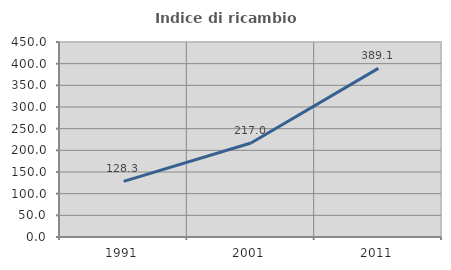
| Category | Indice di ricambio occupazionale  |
|---|---|
| 1991.0 | 128.344 |
| 2001.0 | 216.988 |
| 2011.0 | 389.113 |